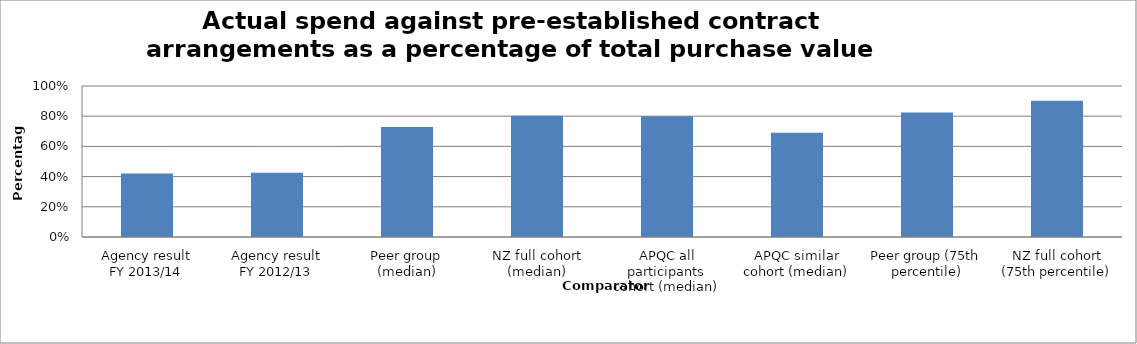
| Category | Result |
|---|---|
| Agency result
FY 2013/14 | 0.42 |
| Agency result
FY 2012/13 | 0.426 |
| Peer group (median) | 0.728 |
| NZ full cohort (median) | 0.804 |
| APQC all participants cohort (median) | 0.8 |
| APQC similar cohort (median) | 0.69 |
| Peer group (75th percentile) | 0.824 |
| NZ full cohort (75th percentile) | 0.902 |